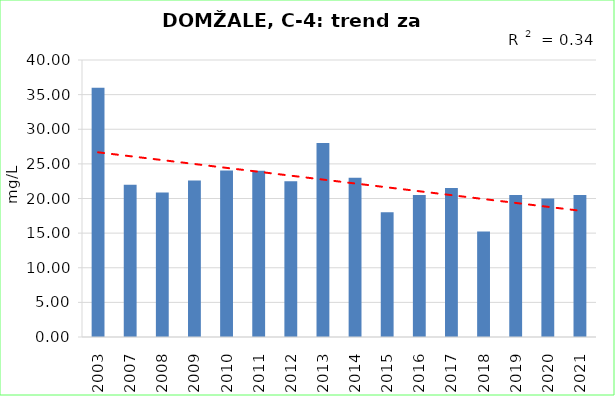
| Category | Vsota |
|---|---|
| 2003 | 36 |
| 2007 | 22 |
| 2008 | 20.85 |
| 2009 | 22.6 |
| 2010 | 24.05 |
| 2011 | 24 |
| 2012 | 22.5 |
| 2013 | 28 |
| 2014 | 23 |
| 2015 | 18 |
| 2016 | 20.5 |
| 2017 | 21.5 |
| 2018 | 15.25 |
| 2019 | 20.5 |
| 2020 | 20 |
| 2021 | 20.5 |